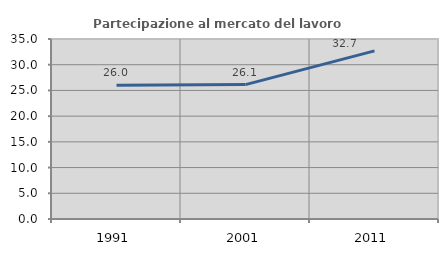
| Category | Partecipazione al mercato del lavoro  femminile |
|---|---|
| 1991.0 | 26 |
| 2001.0 | 26.132 |
| 2011.0 | 32.685 |